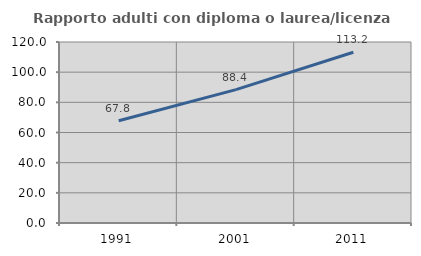
| Category | Rapporto adulti con diploma o laurea/licenza media  |
|---|---|
| 1991.0 | 67.769 |
| 2001.0 | 88.443 |
| 2011.0 | 113.17 |